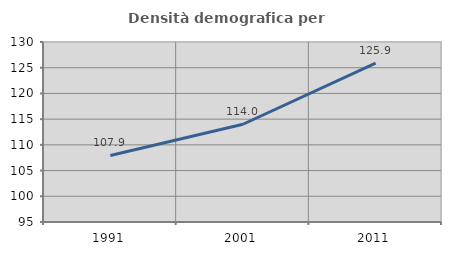
| Category | Densità demografica |
|---|---|
| 1991.0 | 107.943 |
| 2001.0 | 114.008 |
| 2011.0 | 125.875 |